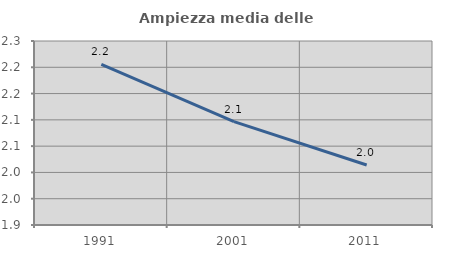
| Category | Ampiezza media delle famiglie |
|---|---|
| 1991.0 | 2.205 |
| 2001.0 | 2.097 |
| 2011.0 | 2.014 |